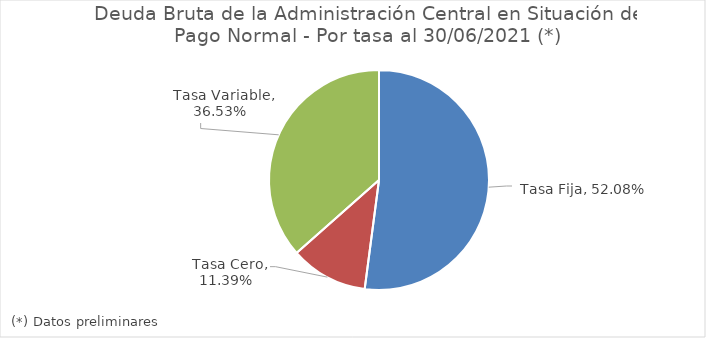
| Category | Series 0 |
|---|---|
|   Tasa Fija | 0.521 |
|   Tasa Cero | 0.114 |
|   Tasa Variable | 0.365 |